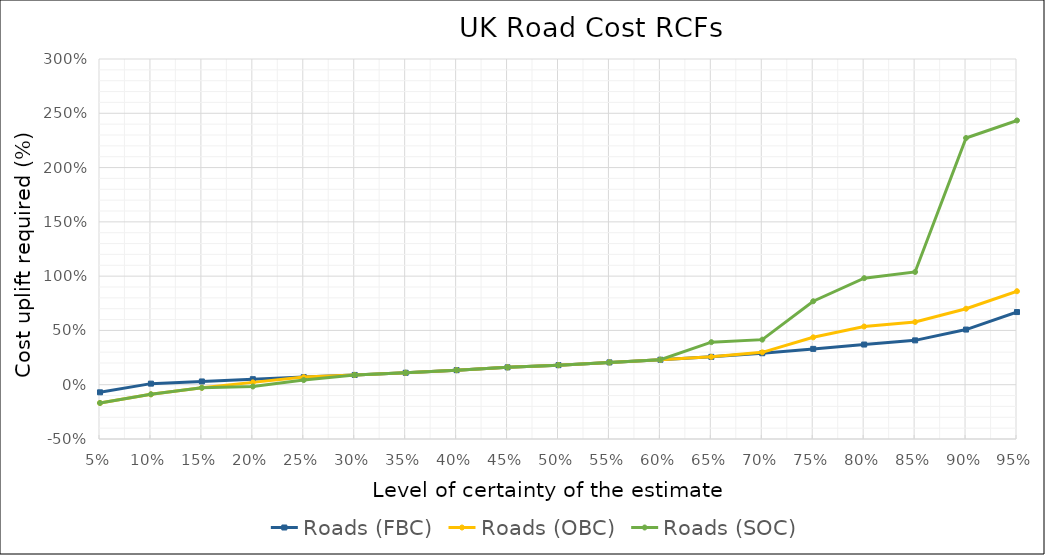
| Category | Roads (FBC) | Roads (OBC) | Roads (SOC) |
|---|---|---|---|
| 0.05 | -0.07 | -0.168 | -0.168 |
| 0.1 | 0.01 | -0.088 | -0.088 |
| 0.15 | 0.03 | -0.028 | -0.028 |
| 0.2 | 0.051 | 0.021 | -0.016 |
| 0.25 | 0.07 | 0.07 | 0.043 |
| 0.3 | 0.09 | 0.09 | 0.09 |
| 0.35 | 0.11 | 0.11 | 0.11 |
| 0.4 | 0.134 | 0.134 | 0.134 |
| 0.45 | 0.16 | 0.16 | 0.16 |
| 0.5 | 0.18 | 0.18 | 0.18 |
| 0.55 | 0.206 | 0.206 | 0.206 |
| 0.6 | 0.23 | 0.23 | 0.23 |
| 0.65 | 0.257 | 0.257 | 0.392 |
| 0.7 | 0.29 | 0.298 | 0.415 |
| 0.75 | 0.33 | 0.436 | 0.769 |
| 0.8 | 0.37 | 0.536 | 0.981 |
| 0.85 | 0.408 | 0.578 | 1.038 |
| 0.9 | 0.508 | 0.7 | 2.273 |
| 0.95 | 0.669 | 0.861 | 2.434 |